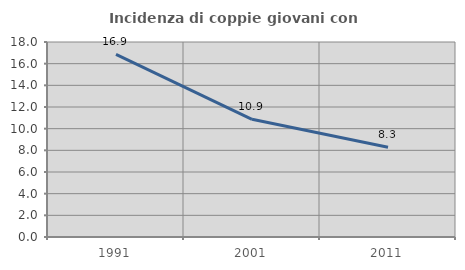
| Category | Incidenza di coppie giovani con figli |
|---|---|
| 1991.0 | 16.865 |
| 2001.0 | 10.863 |
| 2011.0 | 8.285 |